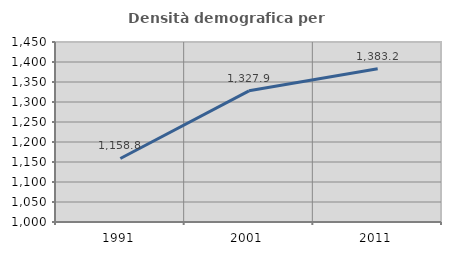
| Category | Densità demografica |
|---|---|
| 1991.0 | 1158.769 |
| 2001.0 | 1327.901 |
| 2011.0 | 1383.186 |